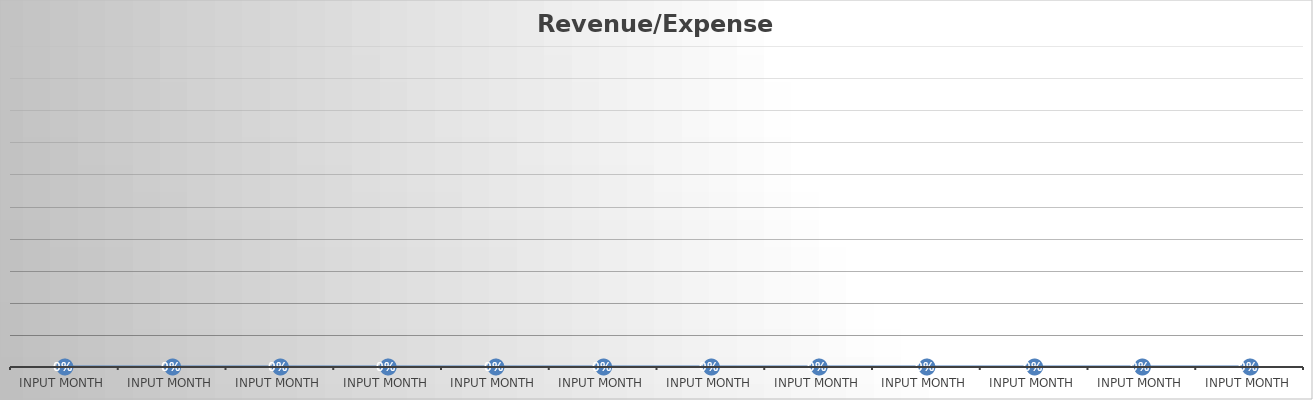
| Category | Revenue/Expenses |
|---|---|
| Input Month | 0 |
| Input Month | 0 |
| Input Month | 0 |
| Input Month | 0 |
| Input Month | 0 |
| Input Month | 0 |
| Input Month | 0 |
| Input Month | 0 |
| Input Month | 0 |
| Input Month | 0 |
| Input Month | 0 |
| Input Month | 0 |